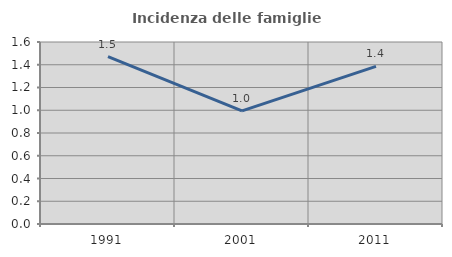
| Category | Incidenza delle famiglie numerose |
|---|---|
| 1991.0 | 1.471 |
| 2001.0 | 0.994 |
| 2011.0 | 1.386 |